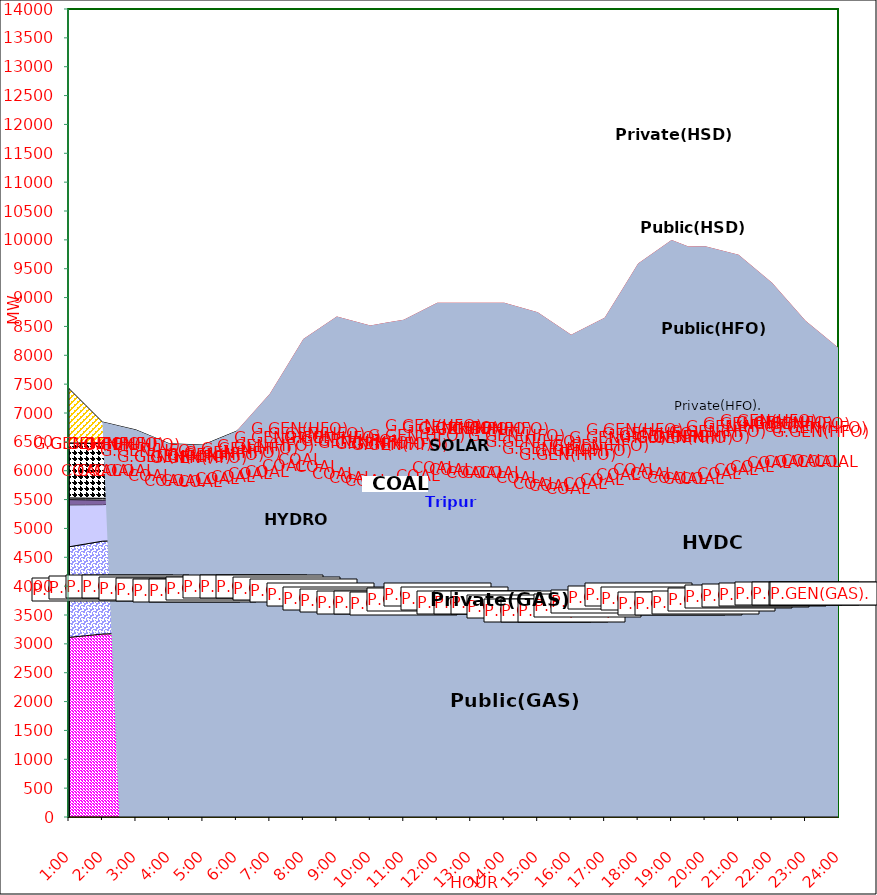
| Category | GAS | P.GEN(GAS). |  HVDC | TRIPURA | HYDRO | COAL | SOLAR | G.GEN(HFO) | P.GEN(HFO). | G.GEN(HSD) | P.GEN(HSD) | SHORTAGE | Total Energy Gen 193.080 MKWHr 
Energy Not Served   0.000 MKWHr 
Energy Requirement     193.080 MKWHr  |
|---|---|---|---|---|---|---|---|---|---|---|---|---|---|
| 1:00 | 3113 | 1569 | 727 | 90 | 30 | 953 | 0 | 0 | 941 | 0 | 0 | 0 |  |
| 1:30 | 3141.5 | 1589 | 680 | 85 | 30 | 953 | 0 | 0 | 655 | 0 | 0 | 0 |  |
| 2:00 | 3170 | 1609 | 633 | 80 | 30 | 953 | 0 | 0 | 369 | 0 | 0 | 0 |  |
| 2:30 | 3180 | 1611 | 633.5 | 80 | 30 | 932 | 0 | 0 | 309 | 0 | 0 | 0 |  |
| 3:00 | 3190 | 1613 | 634 | 80 | 30 | 911 | 0 | 0 | 249 | 0 | 0 | 0 |  |
| 3:30 | 3191 | 1548.5 | 633.5 | 80 | 30 | 872 | 0 | 0 | 232 | 0 | 0 | 0 |  |
| 4:00 | 3192 | 1484 | 633 | 80 | 30 | 833 | 0 | 0 | 215 | 0 | 0 | 0 |  |
| 4:30 | 3190 | 1478 | 633 | 78 | 30 | 832 | 0 | 0 | 215 | 0 | 0 | 0 |  |
| 5:00 | 3188 | 1472 | 633 | 76 | 30 | 831 | 0 | 0 | 215 | 0 | 0 | 0 |  |
| 5:30 | 3212 | 1488.5 | 633 | 78 | 30 | 831 | 0 | 0 | 292 | 0 | 0 | 0 |  |
| 6:00 | 3236 | 1505 | 633 | 80 | 30 | 831 | 0 | 0 | 369 | 0 | 0 | 0 |  |
| 6:30 | 3208.5 | 1570.5 | 633 | 82 | 30 | 845.5 | 3 | 8 | 525 | 0 | 0 | 102.756 |  |
| 7:00 | 3181 | 1636 | 633 | 84 | 30 | 860 | 6 | 16 | 681 | 0 | 0 | 205.511 |  |
| 7:30 | 3145.5 | 1630.5 | 748 | 89 | 30 | 900.5 | 22.5 | 32 | 801.5 | 0 | 0 | 407.336 |  |
| 8:00 | 3110 | 1625 | 863 | 94 | 30 | 941 | 39 | 48 | 922 | 0 | 0 | 609.161 |  |
| 8:30 | 3070 | 1561 | 839 | 98 | 30 | 946.5 | 79 | 58 | 1018 | 0 | 0 | 776.888 |  |
| 9:00 | 3030 | 1497 | 815 | 102 | 30 | 952 | 119 | 68 | 1114 | 0 | 0 | 944.614 |  |
| 9:30 | 3015 | 1462.5 | 815 | 103 | 30 | 925.5 | 146.5 | 68.5 | 1159.5 | 0 | 0 | 869.045 |  |
| 10:00 | 3000 | 1428 | 815 | 104 | 30 | 899 | 174 | 69 | 1205 | 0 | 0 | 793.476 |  |
| 10:30 | 2993 | 1432.5 | 815 | 107 | 30 | 839.5 | 215.5 | 70 | 1208 | 0 | 0 | 856.604 |  |
| 11:00 | 2986 | 1437 | 815 | 110 | 30 | 780 | 257 | 71 | 1211 | 0 | 0 | 919.732 |  |
| 11:30 | 3037.5 | 1477 | 862.5 | 110 | 30 | 790.5 | 264.5 | 85 | 1178 | 0 | 0 | 929.408 |  |
| 12:00 | 3089 | 1517 | 910 | 110 | 30 | 801 | 272 | 99 | 1145 | 0 | 0 | 939.085 |  |
| 12:30 | 3020.5 | 1519 | 910 | 108 | 30 | 857 | 253.5 | 116 | 1139 | 0 | 0 | 958.899 |  |
| 13:00 | 2952 | 1521 | 910 | 106 | 30 | 913 | 235 | 133 | 1133 | 0 | 0 | 978.713 |  |
| 13:30 | 2952 | 1521 | 910 | 106 | 30 | 913 | 235 | 133 | 1133 | 0 | 0 | 978.713 |  |
| 14:00 | 2952 | 1521 | 910 | 106 | 30 | 913 | 235 | 133 | 1133 | 0 | 0 | 978.713 |  |
| 14:30 | 2910.5 | 1467.5 | 910.5 | 107.5 | 30 | 904 | 203.5 | 167.5 | 1142.5 | 0 | 0 | 985.164 |  |
| 15:00 | 2869 | 1414 | 911 | 109 | 30 | 895 | 172 | 202 | 1152 | 0 | 0 | 991.615 |  |
| 15:30 | 2889.5 | 1381.5 | 910 | 104.5 | 30 | 839.5 | 130.5 | 207 | 1217.5 | 0 | 0 | 840.937 |  |
| 16:00 | 2910 | 1349 | 909 | 100 | 30 | 784 | 89 | 212 | 1283 | 0 | 0 | 690.26 |  |
| 16:30 | 2990 | 1342.5 | 909.5 | 102 | 30 | 795 | 53.5 | 269.5 | 1382 | 0 | 0 | 629.897 |  |
| 17:00 | 3070 | 1336 | 910 | 104 | 30 | 806 | 18 | 327 | 1481 | 0 | 0 | 569.533 |  |
| 17:30 | 3104.5 | 1386 | 875 | 117 | 30 | 856.5 | 9 | 387 | 1664.5 | 0 | 45 | 645.767 |  |
| 18:00 | 3139 | 1436 | 840 | 130 | 30 | 907 | 0 | 447 | 1848 | 0 | 90 | 722 |  |
| 18:30 | 3053.5 | 1454.5 | 824 | 127 | 30 | 932 | 0 | 459.5 | 1914 | 0 | 90 | 908.416 |  |
| 19:00 | 2968 | 1473 | 808 | 124 | 30 | 957 | 0 | 472 | 1980 | 0 | 90 | 1094.831 |  |
| 19:30 | 2965 | 1467 | 792 | 126 | 30 | 956 | 0 | 473 | 1961 | 0 | 90 | 1023.409 |  |
| 20:00 | 2979 | 1476 | 792 | 114 | 30 | 955 | 0 | 481 | 2020 | 0 | 90 | 951.987 |  |
| 20:30 | 3022 | 1499 | 803.5 | 113 | 30 | 955 | 0 | 499.5 | 1900.5 | 0 | 90 | 903.143 |  |
| 21:00 | 3065 | 1522 | 815 | 112 | 30 | 955 | 0 | 518 | 1781 | 0 | 90 | 854.3 |  |
| 21:30 | 3080.5 | 1520 | 863 | 110 | 30 | 954.5 | 0 | 512.5 | 1792.5 | 0 | 89.5 | 546.494 |  |
| 22:00 | 3096 | 1518 | 911 | 108 | 30 | 954 | 0 | 507 | 1804 | 0 | 89 | 238.688 |  |
| 22:30 | 3097 | 1534 | 910.5 | 109 | 30 | 954 | 0 | 418 | 1691.5 | 0 | 44.5 | 139.158 |  |
| 23:00 | 3098 | 1550 | 910 | 110 | 30 | 954 | 0 | 329 | 1579 | 0 | 0 | 39.628 |  |
| 23:30 | 3098 | 1547 | 910 | 104 | 30 | 954 | 0 | 204.5 | 1473 | 0 | 0 | 39.628 |  |
| 24:00 | 3098 | 1544 | 910 | 98 | 30 | 954 | 0 | 80 | 1367 | 0 | 0 | 39.628 |  |